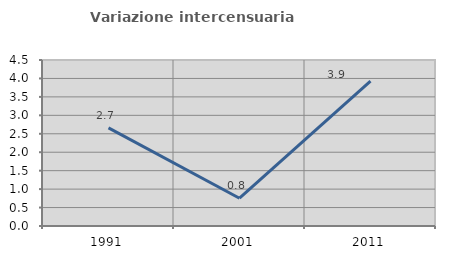
| Category | Variazione intercensuaria annua |
|---|---|
| 1991.0 | 2.662 |
| 2001.0 | 0.753 |
| 2011.0 | 3.93 |